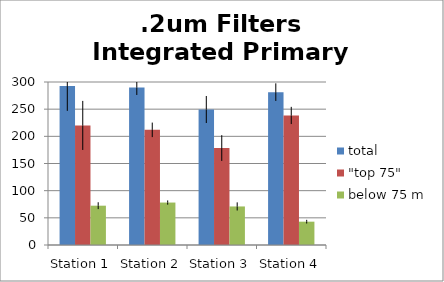
| Category | total | "top 75" | below 75 m |
|---|---|---|---|
| Station 1 | 292.445 | 220.082 | 72.363 |
| Station 2 | 290.044 | 211.924 | 78.12 |
| Station 3 | 249.388 | 178.434 | 70.954 |
| Station 4 | 281.335 | 238.411 | 42.924 |